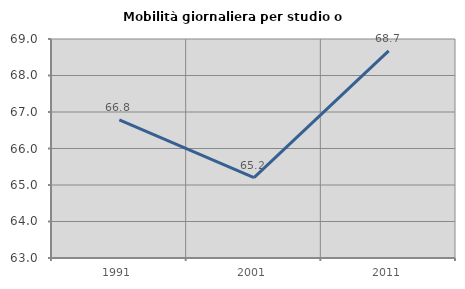
| Category | Mobilità giornaliera per studio o lavoro |
|---|---|
| 1991.0 | 66.788 |
| 2001.0 | 65.2 |
| 2011.0 | 68.672 |